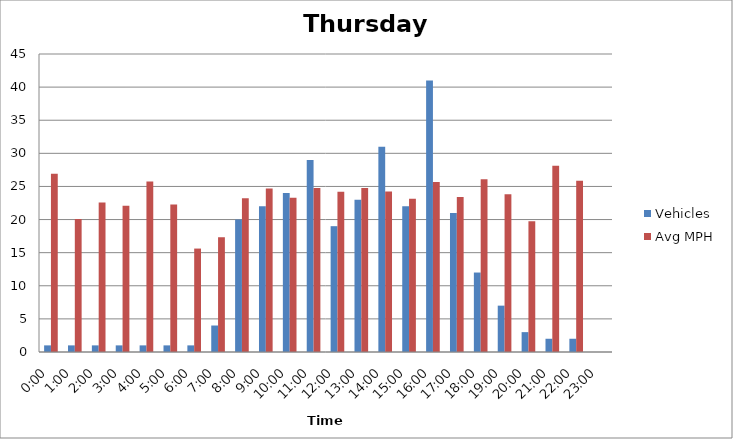
| Category | Vehicles | Avg MPH |
|---|---|---|
| 0:00 | 1 | 26.9 |
| 1:00 | 1 | 20.08 |
| 2:00 | 1 | 22.57 |
| 3:00 | 1 | 22.09 |
| 4:00 | 1 | 25.76 |
| 5:00 | 1 | 22.28 |
| 6:00 | 1 | 15.62 |
| 7:00 | 4 | 17.33 |
| 8:00 | 20 | 23.2 |
| 9:00 | 22 | 24.68 |
| 10:00 | 24 | 23.3 |
| 11:00 | 29 | 24.75 |
| 12:00 | 19 | 24.18 |
| 13:00 | 23 | 24.78 |
| 14:00 | 31 | 24.24 |
| 15:00 | 22 | 23.14 |
| 16:00 | 41 | 25.69 |
| 17:00 | 21 | 23.41 |
| 18:00 | 12 | 26.09 |
| 19:00 | 7 | 23.83 |
| 20:00 | 3 | 19.75 |
| 21:00 | 2 | 28.13 |
| 22:00 | 2 | 25.87 |
| 23:00 | 0 | 0 |